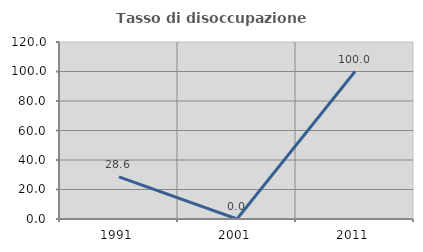
| Category | Tasso di disoccupazione giovanile  |
|---|---|
| 1991.0 | 28.571 |
| 2001.0 | 0 |
| 2011.0 | 100 |